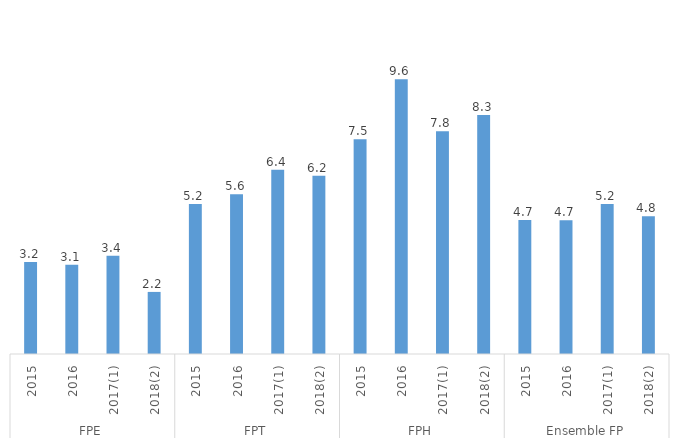
| Category | Apprentis en situation de handicap |
|---|---|
| 0 | 3.208 |
| 1 | 3.112 |
| 2 | 3.423 |
| 3 | 2.165 |
| 4 | 5.237 |
| 5 | 5.575 |
| 6 | 6.425 |
| 7 | 6.219 |
| 8 | 7.491 |
| 9 | 9.583 |
| 10 | 7.769 |
| 11 | 8.333 |
| 12 | 4.67 |
| 13 | 4.662 |
| 14 | 5.229 |
| 15 | 4.806 |